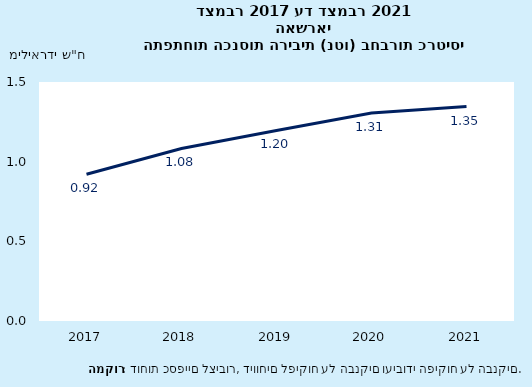
| Category | הכנסות ריבית, נטו |
|---|---|
| 2017-12-31 | 0.921 |
| 2018-12-31 | 1.083 |
| 2019-12-31 | 1.196 |
| 2020-12-31 | 1.306 |
| 2021-12-31 | 1.346 |